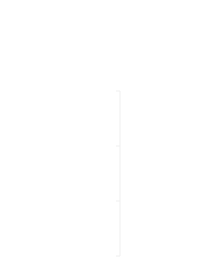
| Category | Positiv | Negativ |
|---|---|---|
| 0 | 0 | 0 |
| 1 | 169 | 0 |
| 2 | 169 | -169 |